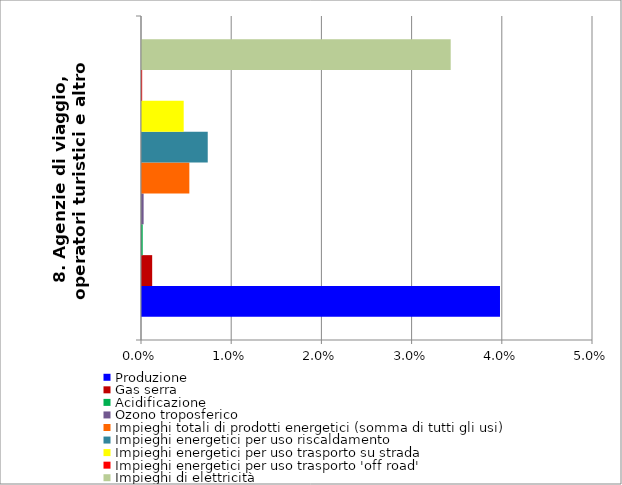
| Category | Produzione | Gas serra | Acidificazione | Ozono troposferico | Impieghi totali di prodotti energetici (somma di tutti gli usi) | Impieghi energetici per uso riscaldamento | Impieghi energetici per uso trasporto su strada | Impieghi energetici per uso trasporto 'off road' | Impieghi di elettricità |
|---|---|---|---|---|---|---|---|---|---|
| 8. Agenzie di viaggio, operatori turistici e altro | 0.04 | 0.001 | 0 | 0 | 0.005 | 0.007 | 0.005 | 0 | 0.034 |